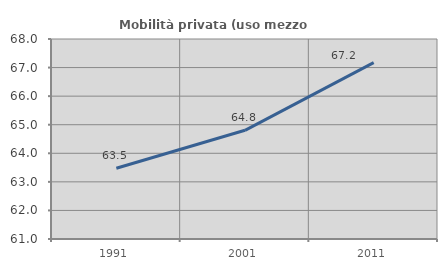
| Category | Mobilità privata (uso mezzo privato) |
|---|---|
| 1991.0 | 63.478 |
| 2001.0 | 64.804 |
| 2011.0 | 67.172 |